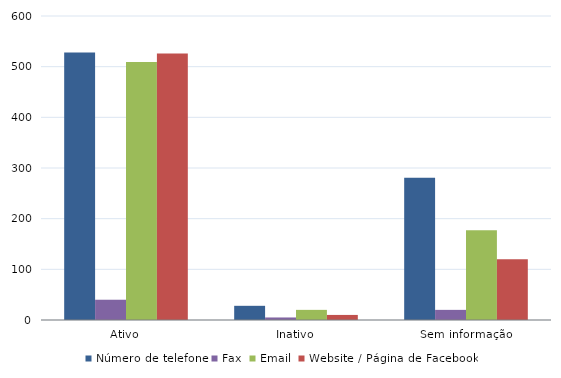
| Category | Número de telefone | Fax | Email | Website / Página de Facebook |
|---|---|---|---|---|
| Ativo | 528 | 40 | 509 | 526 |
| Inativo | 28 | 5 | 20 | 10 |
| Sem informação | 281 | 20 | 177 | 120 |